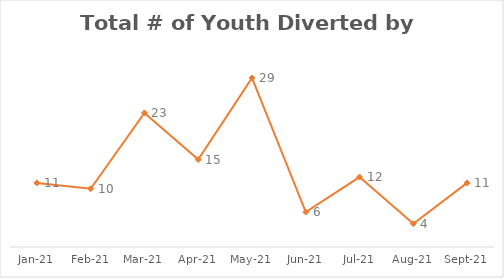
| Category | Series 0 |
|---|---|
| 2021-01-01 | 11 |
| 2021-02-01 | 10 |
| 2021-03-01 | 23 |
| 2021-04-01 | 15 |
| 2021-05-01 | 29 |
| 2021-06-01 | 6 |
| 2021-07-01 | 12 |
| 2021-08-01 | 4 |
| 2021-09-01 | 11 |